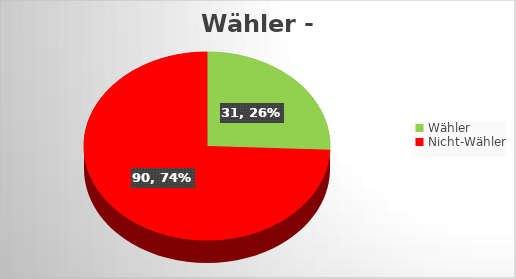
| Category | Series 0 |
|---|---|
| Wähler | 31 |
| Nicht-Wähler | 90 |